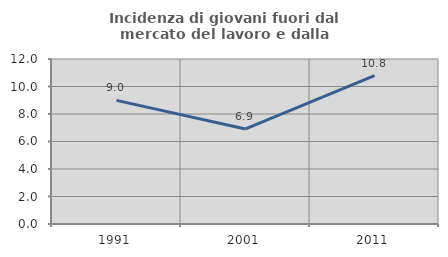
| Category | Incidenza di giovani fuori dal mercato del lavoro e dalla formazione  |
|---|---|
| 1991.0 | 8.993 |
| 2001.0 | 6.912 |
| 2011.0 | 10.784 |